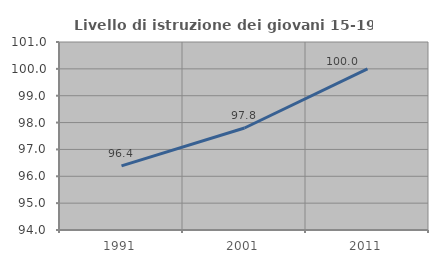
| Category | Livello di istruzione dei giovani 15-19 anni |
|---|---|
| 1991.0 | 96.39 |
| 2001.0 | 97.797 |
| 2011.0 | 100 |